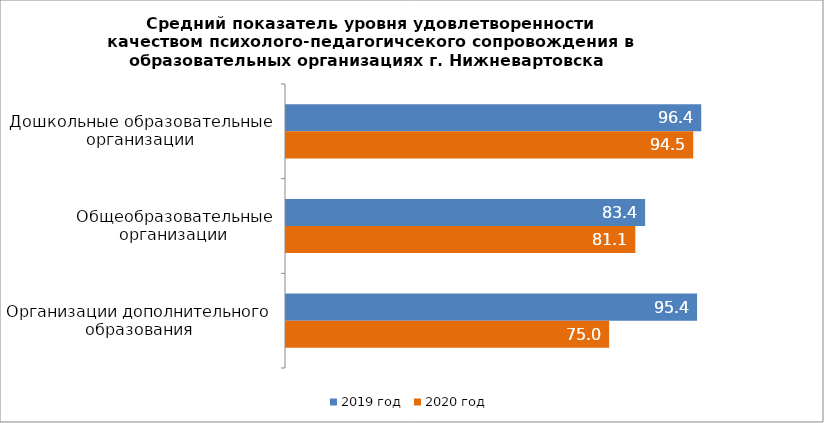
| Category | 2019 год | 2020 год |
|---|---|---|
| Дошкольные образовательные организации | 96.379 | 94.52 |
| Общеобразовательные организации | 83.355 | 81.081 |
| Организации дополнительного образования | 95.419 | 75 |